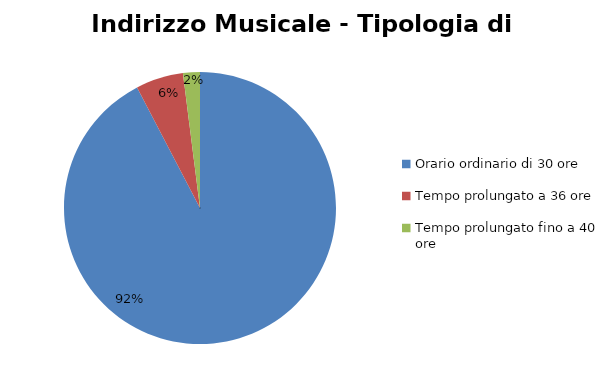
| Category | Series 0 | Series 1 |
|---|---|---|
| Orario ordinario di 30 ore | 2713 |  |
| Tempo prolungato a 36 ore | 166 |  |
| Tempo prolungato fino a 40 ore | 59 |  |